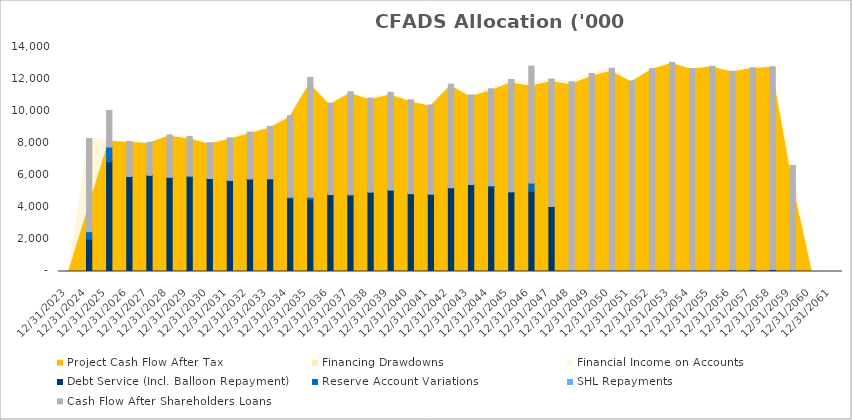
| Category | Debt Service (Incl. Balloon Repayment) | Reserve Account Variations | SHL Repayments | Cash Flow After Shareholders Loans |
|---|---|---|---|---|
| 12/31/23 | 0 | 0 | 0 | 0 |
| 12/31/24 | 2019.463 | 459.811 | 0 | 5794.534 |
| 12/31/25 | 6829.287 | 913.984 | 0 | 2280.751 |
| 12/31/26 | 5907.069 | 8.322 | 0 | 2179.983 |
| 12/31/27 | 5976.308 | 11.858 | 0 | 2054.196 |
| 12/31/28 | 5861.35 | 5.805 | 0 | 2632.18 |
| 12/31/29 | 5900.34 | 38.831 | 0 | 2466.636 |
| 12/31/30 | 5784.239 | 3.048 | 0 | 2226.041 |
| 12/31/31 | 5650.471 | 21.506 | 0 | 2638.341 |
| 12/31/32 | 5751.709 | 14.098 | 0 | 2905.453 |
| 12/31/33 | 5740.597 | 35.523 | 0 | 3250.33 |
| 12/31/34 | 4556.554 | 69.812 | 0 | 5074.527 |
| 12/31/35 | 4489.601 | 132.188 | 0 | 7455.126 |
| 12/31/36 | 4763.81 | 25.339 | 0 | 5682.598 |
| 12/31/37 | 4767.451 | 6.165 | 0 | 6413.796 |
| 12/31/38 | 4932.627 | 12.165 | 0 | 5846.002 |
| 12/31/39 | 5047.85 | 24.844 | 0 | 6074.01 |
| 12/31/40 | 4834.998 | 14.863 | 0 | 5835.853 |
| 12/31/41 | 4811.378 | 0.866 | 0 | 5548.528 |
| 12/31/42 | 5210.975 | 5.348 | 0 | 6442.184 |
| 12/31/43 | 5395.632 | 20.922 | 0 | 5570.087 |
| 12/31/44 | 5274.3 | 72.544 | 0 | 6025.407 |
| 12/31/45 | 4935.487 | 31.074 | 0 | 6983.073 |
| 12/31/46 | 4969.583 | 532.037 | 0 | 7274.888 |
| 12/31/47 | 4039.762 | 0 | 0 | 7945.616 |
| 12/31/48 | 49.625 | 0 | 0 | 11759.349 |
| 12/31/49 | 50.565 | 0 | 0 | 12265.225 |
| 12/31/50 | 51.67 | 0 | 0 | 12592.628 |
| 12/31/51 | 52.803 | 0 | 0 | 11802.935 |
| 12/31/52 | 54.113 | 0 | 0 | 12563.459 |
| 12/31/53 | 55.153 | 0 | 0 | 12945.479 |
| 12/31/54 | 56.373 | 0 | 0 | 12569.734 |
| 12/31/55 | 57.623 | 0 | 0 | 12717.926 |
| 12/31/56 | 98.769 | 0 | 0 | 12354.425 |
| 12/31/57 | 114.202 | 0 | 0 | 12564.024 |
| 12/31/58 | 116.898 | 0 | 0 | 12629.474 |
| 12/31/59 | 39.639 | 0 | 0 | 6566.67 |
| 12/31/60 | 0 | 0 | 0 | 0 |
| 12/31/61 | 0 | 0 | 0 | 0 |
| 12/31/62 | 0 | 0 | 0 | 0 |
| 12/31/63 | 0 | 0 | 0 | 0 |
| 12/31/64 | 0 | 0 | 0 | 0 |
| 12/31/65 | 0 | 0 | 0 | 0 |
| 12/31/66 | 0 | 0 | 0 | 0 |
| 12/31/67 | 0 | 0 | 0 | 0 |
| 12/31/68 | 0 | 0 | 0 | 0 |
| 12/31/69 | 0 | 0 | 0 | 0 |
| 12/31/70 | 0 | 0 | 0 | 0 |
| 12/31/71 | 0 | 0 | 0 | 0 |
| 12/31/72 | 0 | 0 | 0 | 0 |
| 12/31/73 | 0 | 0 | 0 | 0 |
| 12/31/74 | 0 | 0 | 0 | 0 |
| 12/31/75 | 0 | 0 | 0 | 0 |
| 12/31/76 | 0 | 0 | 0 | 0 |
| 12/31/77 | 0 | 0 | 0 | 0 |
| 12/31/78 | 0 | 0 | 0 | 0 |
| 12/31/79 | 0 | 0 | 0 | 0 |
| 12/31/80 | 0 | 0 | 0 | 0 |
| 12/31/81 | 0 | 0 | 0 | 0 |
| 12/31/82 | 0 | 0 | 0 | 0 |